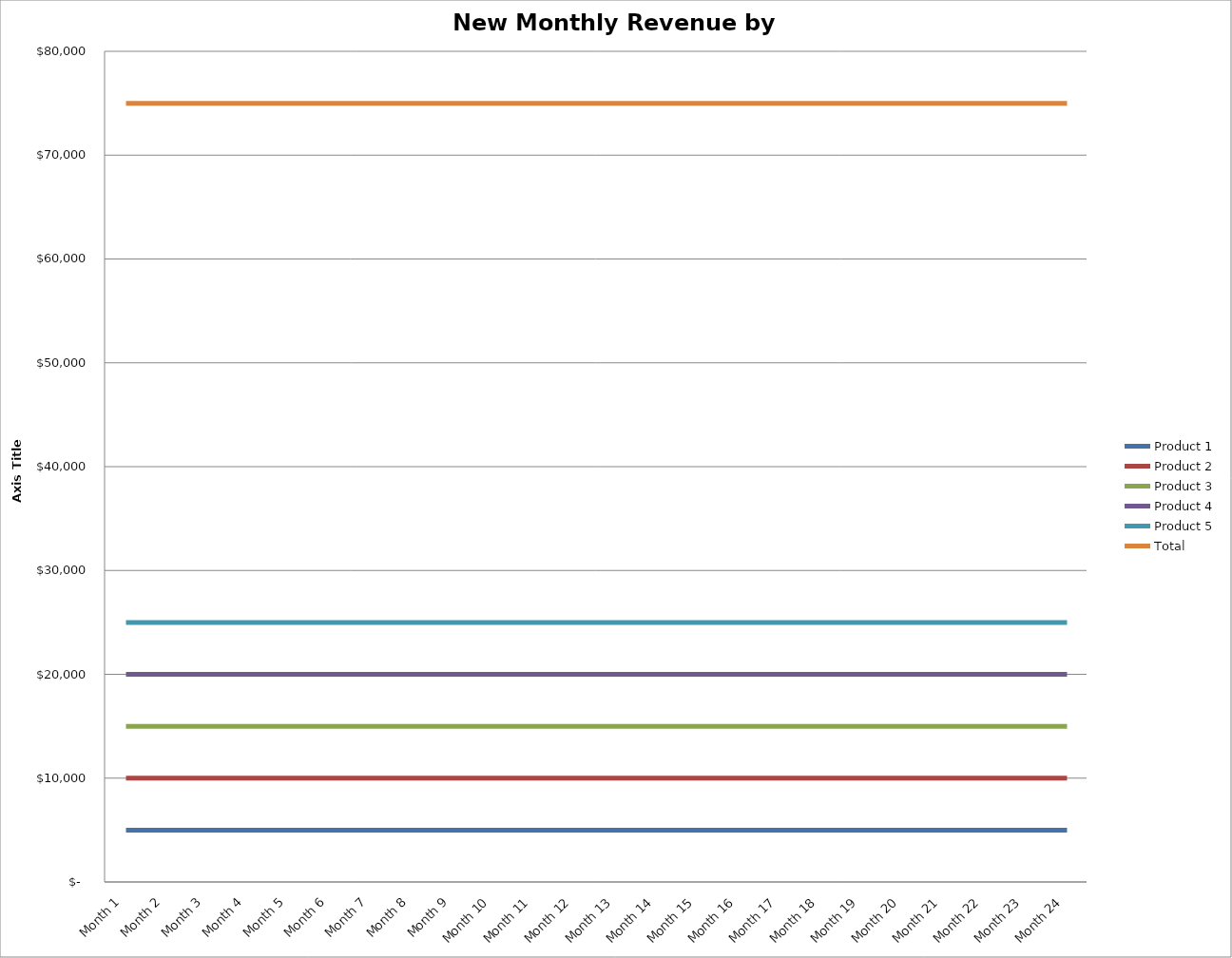
| Category | Product 1 | Product 2 | Product 3 | Product 4 | Product 5 | Total |
|---|---|---|---|---|---|---|
| Month 1 | 5000 | 10000 | 15000 | 20000 | 25000 | 75000 |
| Month 2 | 5000 | 10000 | 15000 | 20000 | 25000 | 75000 |
| Month 3 | 5000 | 10000 | 15000 | 20000 | 25000 | 75000 |
| Month 4 | 5000 | 10000 | 15000 | 20000 | 25000 | 75000 |
| Month 5 | 5000 | 10000 | 15000 | 20000 | 25000 | 75000 |
| Month 6 | 5000 | 10000 | 15000 | 20000 | 25000 | 75000 |
| Month 7 | 5000 | 10000 | 15000 | 20000 | 25000 | 75000 |
| Month 8 | 5000 | 10000 | 15000 | 20000 | 25000 | 75000 |
| Month 9 | 5000 | 10000 | 15000 | 20000 | 25000 | 75000 |
| Month 10 | 5000 | 10000 | 15000 | 20000 | 25000 | 75000 |
| Month 11 | 5000 | 10000 | 15000 | 20000 | 25000 | 75000 |
| Month 12 | 5000 | 10000 | 15000 | 20000 | 25000 | 75000 |
| Month 13 | 5000 | 10000 | 15000 | 20000 | 25000 | 75000 |
| Month 14 | 5000 | 10000 | 15000 | 20000 | 25000 | 75000 |
| Month 15 | 5000 | 10000 | 15000 | 20000 | 25000 | 75000 |
| Month 16 | 5000 | 10000 | 15000 | 20000 | 25000 | 75000 |
| Month 17 | 5000 | 10000 | 15000 | 20000 | 25000 | 75000 |
| Month 18 | 5000 | 10000 | 15000 | 20000 | 25000 | 75000 |
| Month 19 | 5000 | 10000 | 15000 | 20000 | 25000 | 75000 |
| Month 20 | 5000 | 10000 | 15000 | 20000 | 25000 | 75000 |
| Month 21 | 5000 | 10000 | 15000 | 20000 | 25000 | 75000 |
| Month 22 | 5000 | 10000 | 15000 | 20000 | 25000 | 75000 |
| Month 23 | 5000 | 10000 | 15000 | 20000 | 25000 | 75000 |
| Month 24 | 5000 | 10000 | 15000 | 20000 | 25000 | 75000 |